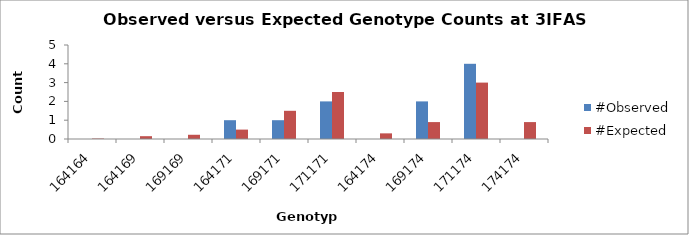
| Category | #Observed | #Expected |
|---|---|---|
| 164164.0 | 0 | 0.025 |
| 164169.0 | 0 | 0.15 |
| 169169.0 | 0 | 0.225 |
| 164171.0 | 1 | 0.5 |
| 169171.0 | 1 | 1.5 |
| 171171.0 | 2 | 2.5 |
| 164174.0 | 0 | 0.3 |
| 169174.0 | 2 | 0.9 |
| 171174.0 | 4 | 3 |
| 174174.0 | 0 | 0.9 |